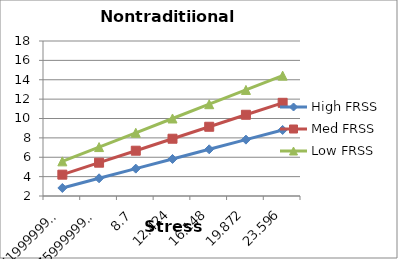
| Category | High FRSS | Med FRSS | Low FRSS |
|---|---|---|---|
| 1.251999999999999 | 2.829 | 4.202 | 5.576 |
| 4.975999999999999 | 3.827 | 5.439 | 7.051 |
| 8.7 | 4.825 | 6.675 | 8.525 |
| 12.424 | 5.822 | 7.911 | 10 |
| 16.148 | 6.82 | 9.148 | 11.475 |
| 19.872 | 7.818 | 10.384 | 12.95 |
| 23.596 | 8.816 | 11.62 | 14.425 |